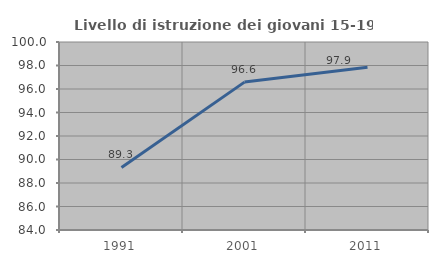
| Category | Livello di istruzione dei giovani 15-19 anni |
|---|---|
| 1991.0 | 89.324 |
| 2001.0 | 96.586 |
| 2011.0 | 97.858 |